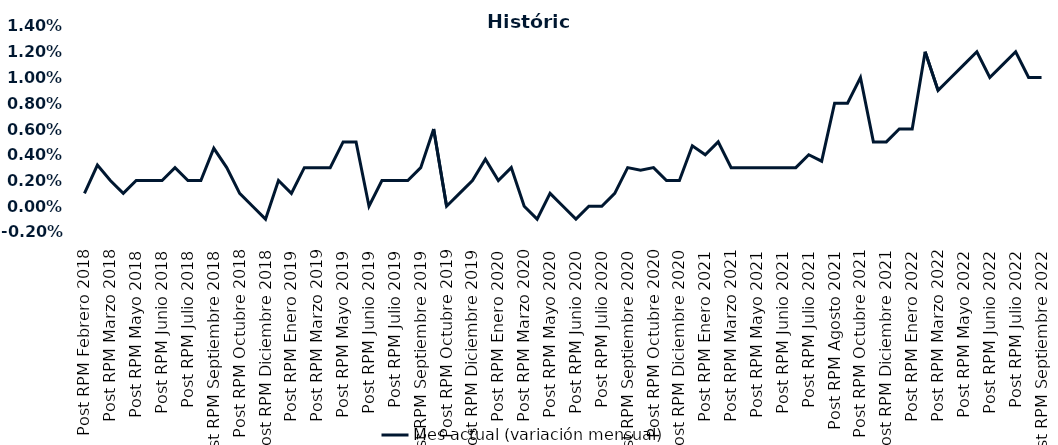
| Category | Mes actual (variación mensual)  |
|---|---|
| Post RPM Febrero 2018 | 0.001 |
| Pre RPM Marzo 2018 | 0.003 |
| Post RPM Marzo 2018 | 0.002 |
| Pre RPM Mayo 2018 | 0.001 |
| Post RPM Mayo 2018 | 0.002 |
| Pre RPM Junio 2018 | 0.002 |
| Post RPM Junio 2018 | 0.002 |
| Pre RPM Julio 2018 | 0.003 |
| Post RPM Julio 2018 | 0.002 |
| Pre RPM Septiembre 2018 | 0.002 |
| Post RPM Septiembre 2018 | 0.004 |
| Pre RPM Octubre 2018 | 0.003 |
| Post RPM Octubre 2018 | 0.001 |
| Pre RPM Diciembre 2018 | 0 |
| Post RPM Diciembre 2018 | -0.001 |
| Pre RPM Enero 2019 | 0.002 |
| Post RPM Enero 2019 | 0.001 |
| Pre RPM Marzo 2019 | 0.003 |
| Post RPM Marzo 2019 | 0.003 |
| Pre RPM Mayo 2019 | 0.003 |
| Post RPM Mayo 2019 | 0.005 |
| Pre RPM Junio 2019 | 0.005 |
| Post RPM Junio 2019 | 0 |
| Pre RPM Julio 2019 | 0.002 |
| Post RPM Julio 2019 | 0.002 |
| Pre RPM Septiembre 2019 | 0.002 |
| Post RPM Septiembre 2019 | 0.003 |
| Pre RPM Octubre 2019 | 0.006 |
| Post RPM Octubre 2019 | 0 |
| Pre RPM Diciembre 2019 | 0.001 |
| Post RPM Diciembre 2019 | 0.002 |
| Pre RPM Enero 2020 | 0.004 |
| Post RPM Enero 2020 | 0.002 |
| Pre RPM Marzo 2020 | 0.003 |
| Post RPM Marzo 2020 | 0 |
| Pre RPM Mayo 2020 | -0.001 |
| Post RPM Mayo 2020 | 0.001 |
| Pre RPM Junio 2020 | 0 |
| Post RPM Junio 2020 | -0.001 |
| Pre RPM Julio 2020 | 0 |
| Post RPM Julio 2020 | 0 |
| Pre RPM Septiembre 2020 | 0.001 |
| Post RPM Septiembre 2020 | 0.003 |
| Pre RPM Octubre 2020 | 0.003 |
| Post RPM Octubre 2020 | 0.003 |
| Pre RPM Diciembre 2020 | 0.002 |
| Post RPM Diciembre 2020 | 0.002 |
| Pre RPM Enero 2021 | 0.005 |
| Post RPM Enero 2021 | 0.004 |
| Pre RPM Marzo 2021 | 0.005 |
| Post RPM Marzo 2021 | 0.003 |
| Pre RPM Mayo 2021 | 0.003 |
| Post RPM Mayo 2021 | 0.003 |
| Pre RPM Junio 2021 | 0.003 |
| Post RPM Junio 2021 | 0.003 |
| Pre RPM Julio 2021 | 0.003 |
| Post RPM Julio 2021 | 0.004 |
| Pre RPM Agosto 2021 | 0.004 |
| Post RPM Agosto 2021 | 0.008 |
| Pre RPM Octubre 2021 | 0.008 |
| Post RPM Octubre 2021 | 0.01 |
| Pre RPM Diciembre 2021 | 0.005 |
| Post RPM Diciembre 2021 | 0.005 |
| Pre RPM Enero 2022 | 0.006 |
| Post RPM Enero 2022 | 0.006 |
| Pre RPM Marzo 2022 | 0.012 |
| Post RPM Marzo 2022 | 0.009 |
| Pre RPM Mayo 2022 | 0.01 |
| Post RPM Mayo 2022 | 0.011 |
| Pre RPM Junio 2022 | 0.012 |
| Post RPM Junio 2022 | 0.01 |
| Pre RPM Julio 2022 | 0.011 |
| Post RPM Julio 2022 | 0.012 |
| Pre RPM Septiembre 2022 | 0.01 |
| Post RPM Septiembre 2022 | 0.01 |